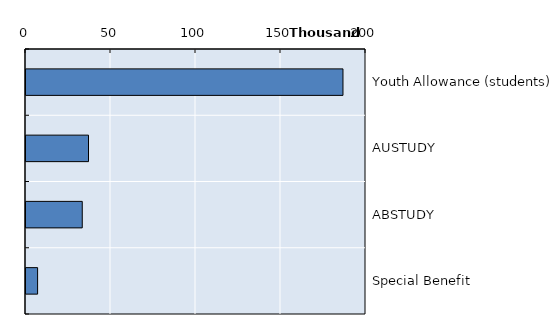
| Category | Series 0 |
|---|---|
| Youth Allowance (students) | 186457 |
| AUSTUDY | 36772 |
| ABSTUDY | 33095 |
| Special Benefit | 6823 |